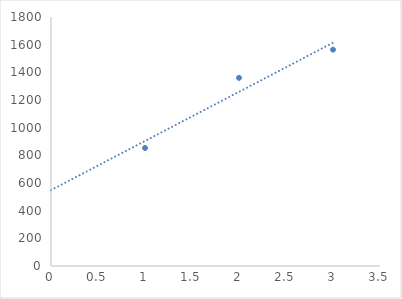
| Category | Series 0 |
|---|---|
| 0 | 853.172 |
| 1 | 1360.104 |
| 2 | 1563.633 |